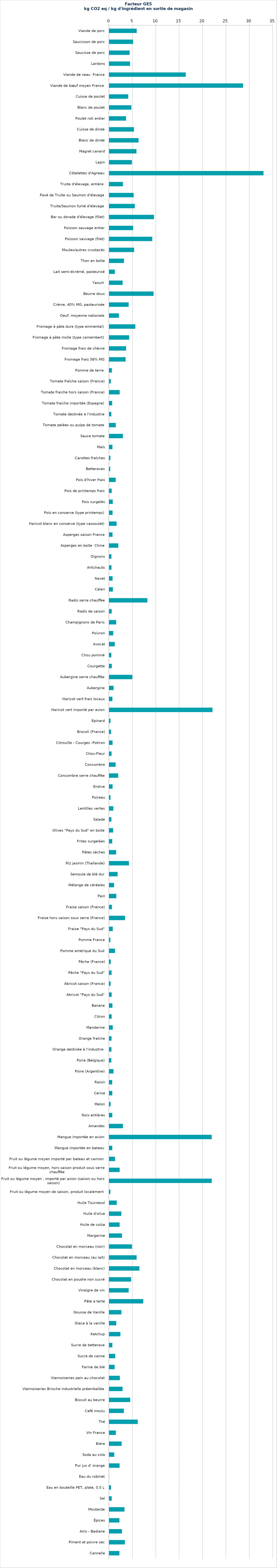
| Category | Series 0 |
|---|---|
| Viande de porc | 5.889 |
| Saucisson de porc | 5.118 |
| Saucisse de porc | 4.385 |
| Lardons | 4.461 |
| Viande de veau  France | 16.374 |
| Viande de bœuf moyen France | 28.626 |
| Cuisse de poulet | 4.079 |
| Blanc de poulet | 4.751 |
| Poulet roti entier | 3.611 |
| Cuisse de dinde | 5.305 |
| Blanc de dinde | 6.282 |
| Magret canard | 5.834 |
| Lapin | 4.859 |
| Côtelettes d'Agneau | 33.001 |
| Truite d'élevage, entière  | 2.943 |
| Pavé de Truite ou Saumon d'élevage | 5.24 |
| Truite/Saumon fumé d'élevage | 5.485 |
| Bar ou dorade d'élevage (filet) | 9.587 |
| Poisson sauvage entier | 5.123 |
| Poisson sauvage (filet) | 9.221 |
| Moules/autres crustacés | 5.334 |
| Thon en boîte | 3.16 |
| Lait semi-écrémé, pasteurisé | 1.222 |
| Yaourt  | 2.877 |
| Beurre doux | 9.494 |
| Crème, 40% MG, pasteurisée | 4.159 |
| Oeuf, moyenne nationale | 2.085 |
| Fromage à pâte dure (type emmental) | 5.596 |
| Fromage à pâte molle (type camembert) | 4.279 |
| Fromage frais de chèvre | 3.613 |
| Fromage frais 58% MG | 3.513 |
| Pomme de terre  | 0.585 |
| Tomate fraîche saison (France) | 0.343 |
| Tomate fraiche hors saison (France) | 2.242 |
| Tomate fraiche importée (Espagne) | 0.645 |
| Tomate destinée à l'industrie | 0.462 |
| Tomate pelées ou pulpe de tomate | 1.409 |
| Sauce tomate | 2.939 |
| Maïs | 0.701 |
| Carottes fraîches | 0.258 |
| Betteraves | 0.224 |
| Pois d'hiver frais | 1.398 |
| Pois de printemps frais | 0.542 |
| Pois surgelés | 0.768 |
| Pois en conserve (type printemps) | 0.728 |
| Haricot blanc en conserve (type cassoulet) | 1.587 |
| Asperges saison France | 0.718 |
| Asperges en boite  Chine | 1.951 |
| Oignons | 0.485 |
| Artichauts | 0.498 |
| Navet | 0.728 |
| Céleri | 0.799 |
| Radis serre chauffée | 8.178 |
| Radis de saison | 0.536 |
| Champignons de Paris | 1.502 |
| Poivron | 0.871 |
| Avocat | 1.199 |
| Chou pommé | 0.461 |
| Courgette | 0.564 |
| Aubergine serre chauffée | 4.951 |
| Aubergine | 0.944 |
| Haricot vert frais locaux | 0.69 |
| Haricot vert importé par avion | 22.09 |
| Epinard | 0.292 |
| Brocoli (France) | 0.39 |
| Citrouille - Courges -Potiron | 0.729 |
| Chou-Fleur | 0.515 |
| Concombre | 1.379 |
| Concombre serre chauffée | 1.931 |
| Endive | 0.729 |
| Poireau | 0.29 |
| Lentilles vertes | 0.887 |
| Salade | 0.479 |
| Olives "Pays du Sud" en boite | 0.858 |
| Frites surgelées | 0.65 |
| Pâtes sèches | 1.485 |
| Riz jasmin (Thaïlande) | 4.229 |
| Semoule de blé dur | 1.8 |
| Mélange de céréales | 1.03 |
| Pain | 1.523 |
| Fraise saison (France) | 0.591 |
| Fraise hors saison sous serre (France) | 3.405 |
| Fraise "Pays du Sud" | 0.772 |
| Pomme France | 0.259 |
| Pomme amérique du Sud | 1.252 |
| Pêche (France) | 0.346 |
| Pêche "Pays du Sud" | 0.514 |
| Abricot saison (France) | 0.312 |
| Abricot "Pays du Sud" | 0.53 |
| Banane | 0.698 |
| Citron | 0.529 |
| Mandarine | 0.767 |
| Orange fraîche | 0.509 |
| Orange destinée à l'industrie  | 0.491 |
| Poire (Belgique) | 0.45 |
| Poire (Argentine) | 0.927 |
| Raisin | 0.642 |
| Cerise | 0.663 |
| Melon | 0.313 |
| Noix entières | 0.663 |
| Amandes | 2.941 |
| Mangue importée en avion | 21.929 |
| Mangue importée en bateau | 0.66 |
| Fruit ou légume moyen importé par bateau et camion | 1.252 |
| Fruit ou légume moyen, hors saison produit sous serre chauffée | 2.242 |
| Fruit ou légume moyen , importé par avion (saison ou hors saison) | 21.929 |
| Fruit ou légume moyen de saison, produit localement | 0.259 |
| Huile Tournesol | 1.623 |
| Huile d'olive | 2.604 |
| Huile de colza | 2.236 |
| Margarine | 2.741 |
| Chocolat en morceau (noir) | 4.874 |
| Chocolat en morceau (au lait) | 5.866 |
| Chocolat en morceau (blanc) | 6.463 |
| Chocolat en poudre non sucré | 4.703 |
| Vinaigre de vin | 4.168 |
| Pâte à tarte | 7.286 |
| Gousse de Vanille | 2.613 |
| Glace à la vanille | 1.51 |
| Ketchup | 2.395 |
| Sucre de betterave | 0.682 |
| Sucre de canne | 1.281 |
| Farine de blé | 1.169 |
| Viennoiseries pain au chocolat | 2.28 |
| Viennoiseries Brioche industrielle préemballée | 2.87 |
| Biscuit au beurre | 4.504 |
| Café moulu | 3.143 |
| Thé | 6.107 |
| Vin France | 1.433 |
| Bière | 2.665 |
| Soda au cola | 1.087 |
| Pur jus d' orange | 2.224 |
| Eau du robinet | 0 |
| Eau en bouteille PET, plate, 0.5 L | 0.393 |
| Sel | 0.544 |
| Moutarde | 3.272 |
| Épices | 2.194 |
| Anis - Badiane | 2.734 |
| Piment et poivre sec | 3.364 |
| Cannelle | 2.194 |